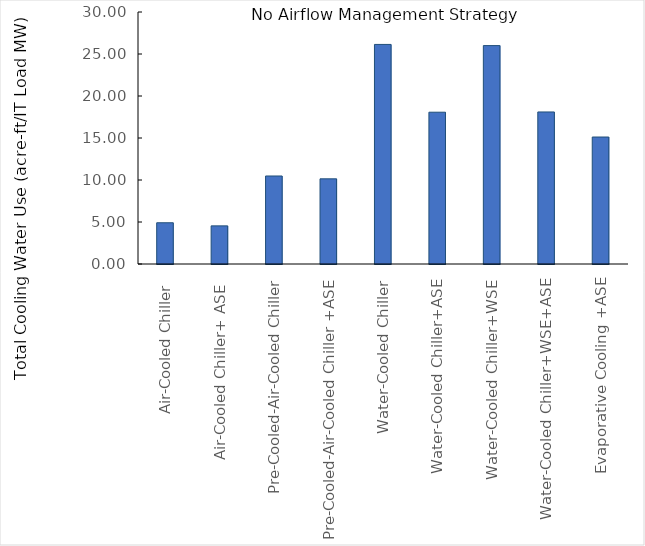
| Category | Series 0 |
|---|---|
| Air-Cooled Chiller  | 4.91 |
| Air-Cooled Chiller+ ASE  | 4.539 |
| Pre-Cooled-Air-Cooled Chiller | 10.477 |
| Pre-Cooled-Air-Cooled Chiller +ASE | 10.139 |
| Water-Cooled Chiller | 26.14 |
| Water-Cooled Chiller+ASE | 18.07 |
| Water-Cooled Chiller+WSE | 26 |
| Water-Cooled Chiller+WSE+ASE | 18.1 |
| Evaporative Cooling +ASE | 15.116 |